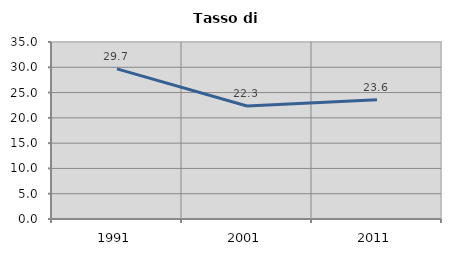
| Category | Tasso di disoccupazione   |
|---|---|
| 1991.0 | 29.694 |
| 2001.0 | 22.34 |
| 2011.0 | 23.59 |